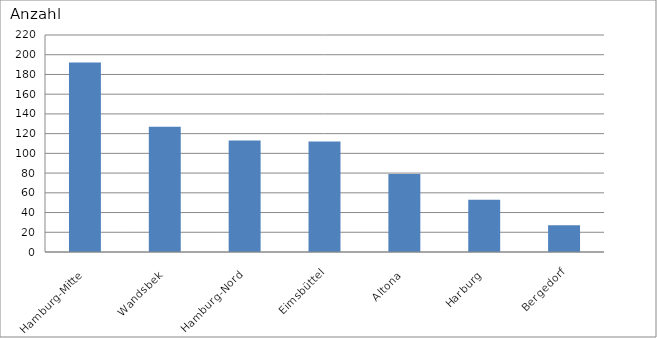
| Category | Hamburg-Mitte Wandsbek Hamburg-Nord Eimsbüttel Altona Harburg Bergedorf |
|---|---|
| Hamburg-Mitte | 192 |
| Wandsbek | 127 |
| Hamburg-Nord | 113 |
| Eimsbüttel | 112 |
| Altona | 79 |
| Harburg | 53 |
| Bergedorf | 27 |